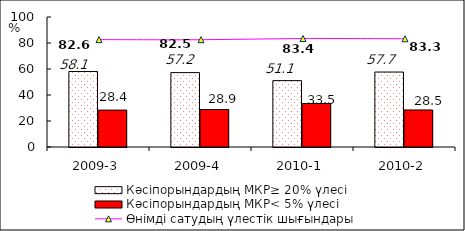
| Category | Кәсіпорындардың МКР≥ 20% үлесі | Кәсіпорындардың МКР< 5% үлесі |
|---|---|---|
| 2009-3 | 58.093 | 28.387 |
| 2009-4 | 57.213 | 28.853 |
| 2010-1 | 51.061 | 33.475 |
| 2010-2 | 57.668 | 28.494 |